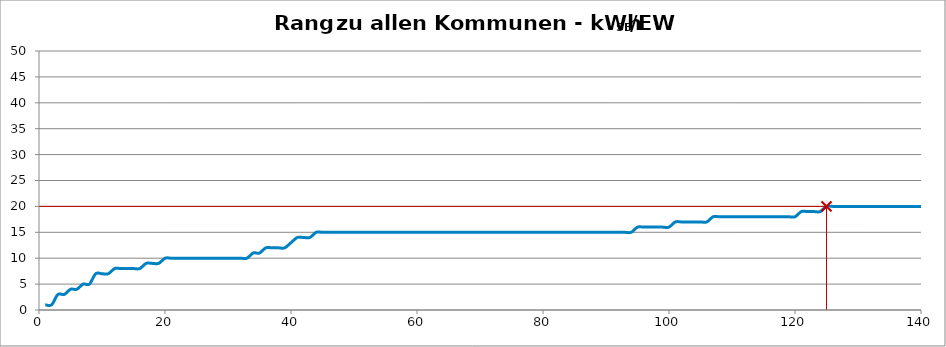
| Category | Kommunenrangfolge |
|---|---|
| 0 | 1 |
| 1 | 1 |
| 2 | 3 |
| 3 | 3 |
| 4 | 4 |
| 5 | 4 |
| 6 | 5 |
| 7 | 5 |
| 8 | 7 |
| 9 | 7 |
| 10 | 7 |
| 11 | 8 |
| 12 | 8 |
| 13 | 8 |
| 14 | 8 |
| 15 | 8 |
| 16 | 9 |
| 17 | 9 |
| 18 | 9 |
| 19 | 10 |
| 20 | 10 |
| 21 | 10 |
| 22 | 10 |
| 23 | 10 |
| 24 | 10 |
| 25 | 10 |
| 26 | 10 |
| 27 | 10 |
| 28 | 10 |
| 29 | 10 |
| 30 | 10 |
| 31 | 10 |
| 32 | 10 |
| 33 | 11 |
| 34 | 11 |
| 35 | 12 |
| 36 | 12 |
| 37 | 12 |
| 38 | 12 |
| 39 | 13 |
| 40 | 14 |
| 41 | 14 |
| 42 | 14 |
| 43 | 15 |
| 44 | 15 |
| 45 | 15 |
| 46 | 15 |
| 47 | 15 |
| 48 | 15 |
| 49 | 15 |
| 50 | 15 |
| 51 | 15 |
| 52 | 15 |
| 53 | 15 |
| 54 | 15 |
| 55 | 15 |
| 56 | 15 |
| 57 | 15 |
| 58 | 15 |
| 59 | 15 |
| 60 | 15 |
| 61 | 15 |
| 62 | 15 |
| 63 | 15 |
| 64 | 15 |
| 65 | 15 |
| 66 | 15 |
| 67 | 15 |
| 68 | 15 |
| 69 | 15 |
| 70 | 15 |
| 71 | 15 |
| 72 | 15 |
| 73 | 15 |
| 74 | 15 |
| 75 | 15 |
| 76 | 15 |
| 77 | 15 |
| 78 | 15 |
| 79 | 15 |
| 80 | 15 |
| 81 | 15 |
| 82 | 15 |
| 83 | 15 |
| 84 | 15 |
| 85 | 15 |
| 86 | 15 |
| 87 | 15 |
| 88 | 15 |
| 89 | 15 |
| 90 | 15 |
| 91 | 15 |
| 92 | 15 |
| 93 | 15 |
| 94 | 16 |
| 95 | 16 |
| 96 | 16 |
| 97 | 16 |
| 98 | 16 |
| 99 | 16 |
| 100 | 17 |
| 101 | 17 |
| 102 | 17 |
| 103 | 17 |
| 104 | 17 |
| 105 | 17 |
| 106 | 18 |
| 107 | 18 |
| 108 | 18 |
| 109 | 18 |
| 110 | 18 |
| 111 | 18 |
| 112 | 18 |
| 113 | 18 |
| 114 | 18 |
| 115 | 18 |
| 116 | 18 |
| 117 | 18 |
| 118 | 18 |
| 119 | 18 |
| 120 | 19 |
| 121 | 19 |
| 122 | 19 |
| 123 | 19 |
| 124 | 20 |
| 125 | 20 |
| 126 | 20 |
| 127 | 20 |
| 128 | 20 |
| 129 | 20 |
| 130 | 20 |
| 131 | 20 |
| 132 | 20 |
| 133 | 20 |
| 134 | 20 |
| 135 | 20 |
| 136 | 20 |
| 137 | 20 |
| 138 | 20 |
| 139 | 20 |
| 140 | 20 |
| 141 | 20 |
| 142 | 20 |
| 143 | 20 |
| 144 | 20 |
| 145 | 20 |
| 146 | 20 |
| 147 | 20 |
| 148 | 20 |
| 149 | 20 |
| 150 | 20 |
| 151 | 20 |
| 152 | 20 |
| 153 | 20 |
| 154 | 20 |
| 155 | 20 |
| 156 | 20 |
| 157 | 20 |
| 158 | 20 |
| 159 | 20 |
| 160 | 20 |
| 161 | 20 |
| 162 | 20 |
| 163 | 20 |
| 164 | 20 |
| 165 | 20 |
| 166 | 20 |
| 167 | 20 |
| 168 | 20 |
| 169 | 22 |
| 170 | 22 |
| 171 | 22 |
| 172 | 22 |
| 173 | 22 |
| 174 | 22 |
| 175 | 22 |
| 176 | 23 |
| 177 | 23 |
| 178 | 24 |
| 179 | 25 |
| 180 | 25 |
| 181 | 25 |
| 182 | 25 |
| 183 | 25 |
| 184 | 25 |
| 185 | 25 |
| 186 | 25 |
| 187 | 25 |
| 188 | 25 |
| 189 | 25 |
| 190 | 25 |
| 191 | 25 |
| 192 | 30 |
| 193 | 30 |
| 194 | 30 |
| 195 | 30 |
| 196 | 30 |
| 197 | 30 |
| 198 | 30 |
| 199 | 35 |
| 200 | 35 |
| 201 | 35 |
| 202 | 38 |
| 203 | 40 |
| 204 | 40 |
| 205 | 40 |
| 206 | 40 |
| 207 | 45 |